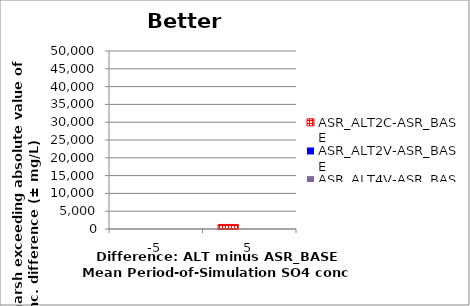
| Category | ASR_ALT2C-ASR_BASE | ASR_ALT2V-ASR_BASE | ASR_ALT4V-ASR_BASE |
|---|---|---|---|
| -5.0 | 0 | 0 | 0 |
| 5.0 | 1275 | 0 | 0 |